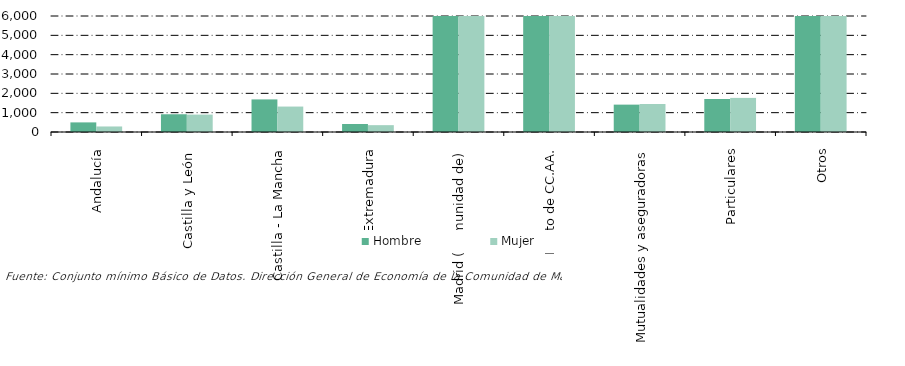
| Category | Hombre | Mujer |
|---|---|---|
| Andalucía | 497 | 286 |
| Castilla y León  | 918 | 900 |
| Castilla - La Mancha | 1686 | 1316 |
| Extremadura | 414 | 354 |
| Madrid (Comunidad de) | 384039 | 480459 |
| Resto de CC.AA. | 191173 | 226813 |
| Mutualidades y aseguradoras | 1416 | 1448 |
| Particulares | 1708 | 1764 |
| Otros | 10889 | 13733 |